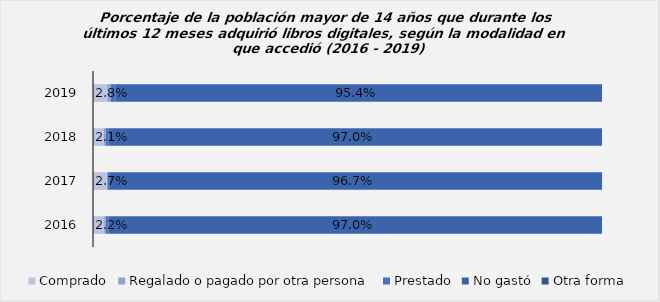
| Category | Comprado | Regalado o pagado por otra persona | Prestado | No gastó | Otra forma |
|---|---|---|---|---|---|
| 2019.0 | 0.028 | 0.007 | 0.009 | 0.954 | 0.002 |
| 2018.0 | 0.021 | 0.004 | 0.005 | 0.97 | 0 |
| 2017.0 | 0.027 | 0.002 | 0.004 | 0.967 | 0 |
| 2016.0 | 0.022 | 0.004 | 0.005 | 0.97 | 0 |